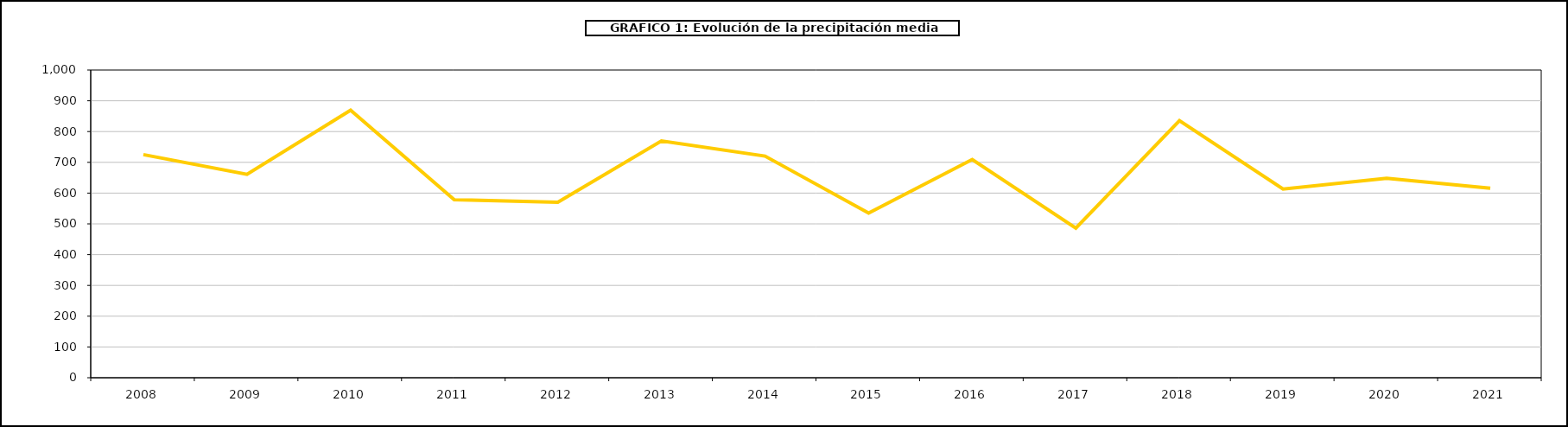
| Category | Series 0 |
|---|---|
| 2008.0 | 725 |
| 2009.0 | 661 |
| 2010.0 | 869.377 |
| 2011.0 | 578.444 |
| 2012.0 | 570.087 |
| 2013.0 | 769.551 |
| 2014.0 | 720.348 |
| 2015.0 | 535.081 |
| 2016.0 | 709 |
| 2017.0 | 486 |
| 2018.0 | 835.465 |
| 2019.0 | 613.3 |
| 2020.0 | 647.9 |
| 2021.0 | 615.6 |